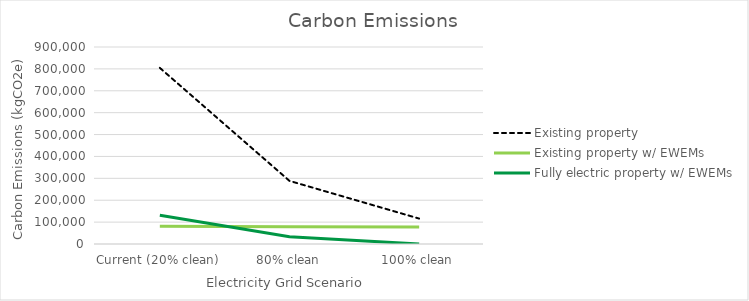
| Category | Existing property | Existing property w/ EWEMs | Fully electric property w/ EWEMs |
|---|---|---|---|
| Current (20% clean) | 804619.261 | 81166.339 | 131724.609 |
| 80% clean | 288256.543 | 78885.192 | 32931.152 |
| 100% clean | 116135.637 | 78124.81 | 0 |